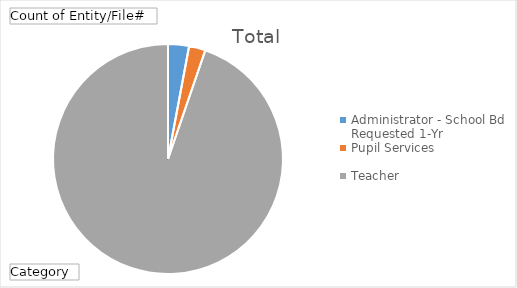
| Category | Total |
|---|---|
| Administrator - School Bd Requested 1-Yr | 89 |
| Pupil Services | 70 |
| Teacher | 2863 |